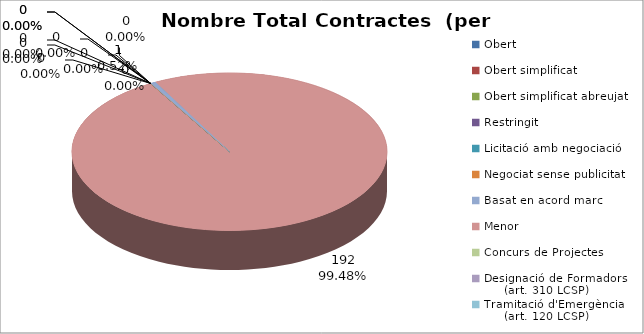
| Category | Nombre Total Contractes |
|---|---|
| Obert | 0 |
| Obert simplificat | 0 |
| Obert simplificat abreujat | 0 |
| Restringit | 0 |
| Licitació amb negociació | 0 |
| Negociat sense publicitat | 0 |
| Basat en acord marc | 1 |
| Menor | 192 |
| Concurs de Projectes | 0 |
| Designació de Formadors
     (art. 310 LCSP) | 0 |
| Tramitació d'Emergència
     (art. 120 LCSP) | 0 |